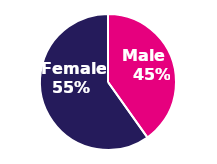
| Category | Series 0 |
|---|---|
| 0 | 8378 |
| 1 | 12476 |